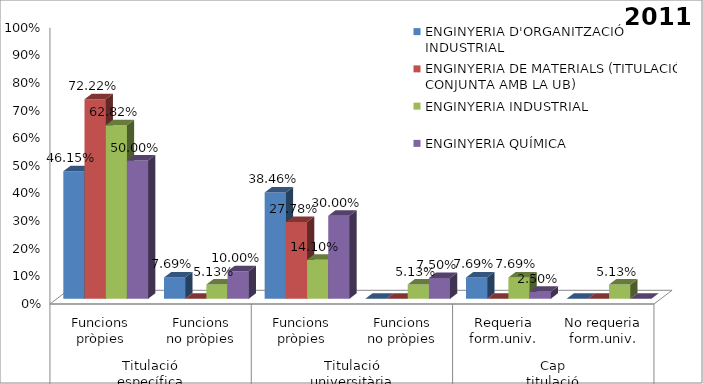
| Category | ENGINYERIA D'ORGANITZACIÓ INDUSTRIAL | ENGINYERIA DE MATERIALS (TITULACIÓ CONJUNTA AMB LA UB) | ENGINYERIA INDUSTRIAL | ENGINYERIA QUÍMICA |
|---|---|---|---|---|
| 0 | 0.462 | 0.722 | 0.628 | 0.5 |
| 1 | 0.077 | 0 | 0.051 | 0.1 |
| 2 | 0.385 | 0.278 | 0.141 | 0.3 |
| 3 | 0 | 0 | 0.051 | 0.075 |
| 4 | 0.077 | 0 | 0.077 | 0.025 |
| 5 | 0 | 0 | 0.051 | 0 |